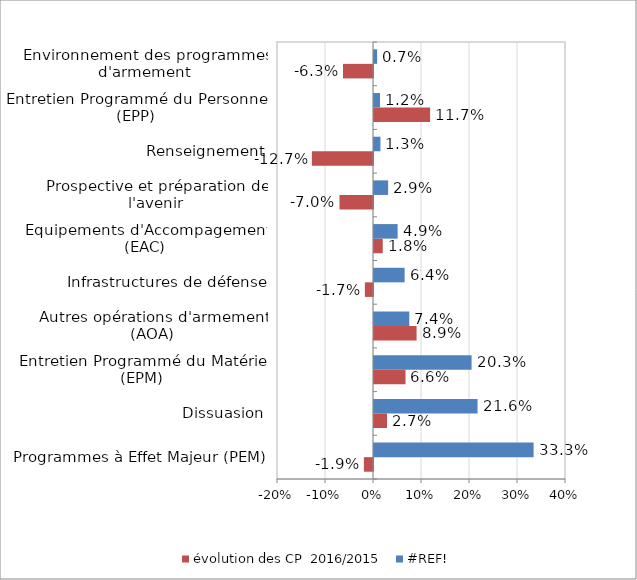
| Category | évolution des CP  2016/2015 | #REF! |
|---|---|---|
| Programmes à Effet Majeur (PEM) | -0.019 | 0.333 |
| Dissuasion | 0.027 | 0.216 |
| Entretien Programmé du Matériel (EPM) | 0.066 | 0.203 |
| Autres opérations d'armement (AOA) | 0.089 | 0.074 |
| Infrastructures de défense | -0.017 | 0.064 |
| Equipements d'Accompagement (EAC) | 0.018 | 0.049 |
| Prospective et préparation de l'avenir | -0.07 | 0.029 |
| Renseignement | -0.127 | 0.013 |
| Entretien Programmé du Personnel (EPP) | 0.117 | 0.012 |
| Environnement des programmes d'armement | -0.063 | 0.007 |